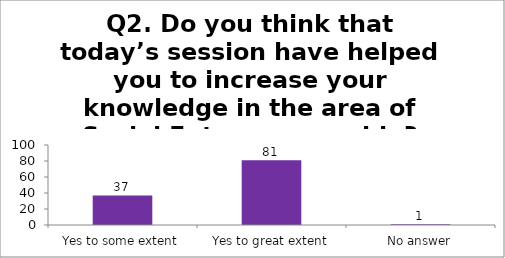
| Category | Q2. Do you think that today’s session have helped you to increase your knowledge in the area of Social Entrepreneurship? |
|---|---|
| Yes to some extent | 37 |
| Yes to great extent | 81 |
| No answer | 1 |